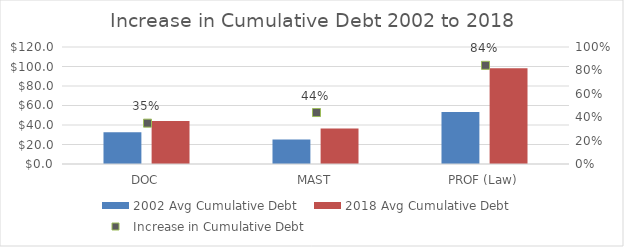
| Category | 2002 Avg Cumulative Debt | 2018 Avg Cumulative Debt |
|---|---|---|
| DOC | 32607.944 | 43993.638 |
| MAST | 25214.114 | 36304.401 |
| PROF (Law) | 53255.438 | 98168.338 |